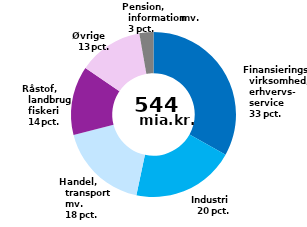
| Category | Series 0 |
|---|---|
| Finansieringsvirksomhed, erhvervsservice | 180 |
| Industri | 110.132 |
| Handel, transport mv. | 96.23 |
| Råstofudvinding, landbrug og fiskeri | 73.629 |
| Øvrige | 69.009 |
| Pension, forsikring,  information mv. | 15 |